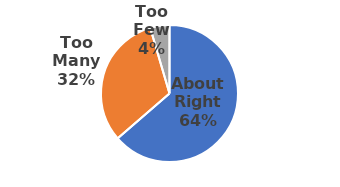
| Category | Series 0 |
|---|---|
| About Right | 28 |
| Too Many | 14 |
| Too Few | 2 |